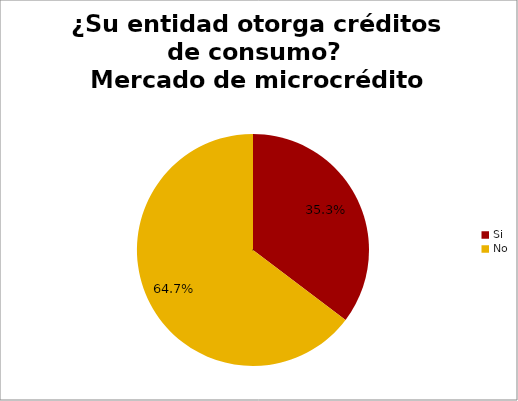
| Category | ¿Su entidad otorga créditos de consumo? Mercado de microcrédito |
|---|---|
| Si | 0.353 |
| No | 0.647 |